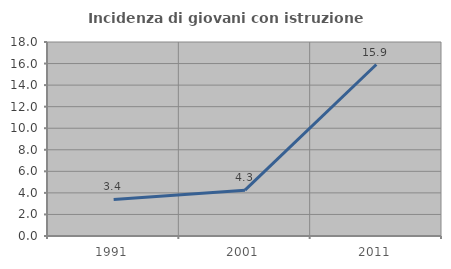
| Category | Incidenza di giovani con istruzione universitaria |
|---|---|
| 1991.0 | 3.39 |
| 2001.0 | 4.255 |
| 2011.0 | 15.909 |